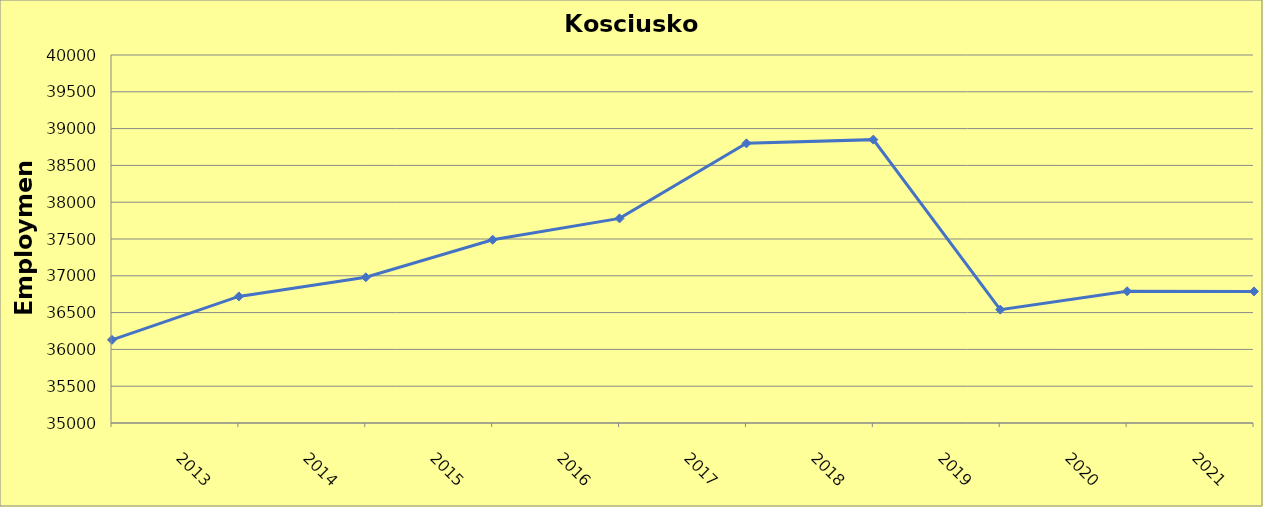
| Category | Kosciusko County |
|---|---|
| 2013.0 | 36130 |
| 2014.0 | 36720 |
| 2015.0 | 36980 |
| 2016.0 | 37490 |
| 2017.0 | 37780 |
| 2018.0 | 38800 |
| 2019.0 | 38850 |
| 2020.0 | 36540 |
| 2021.0 | 36790 |
| 2022.0 | 36788 |